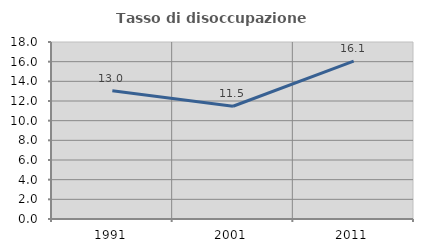
| Category | Tasso di disoccupazione giovanile  |
|---|---|
| 1991.0 | 13.043 |
| 2001.0 | 11.465 |
| 2011.0 | 16.058 |